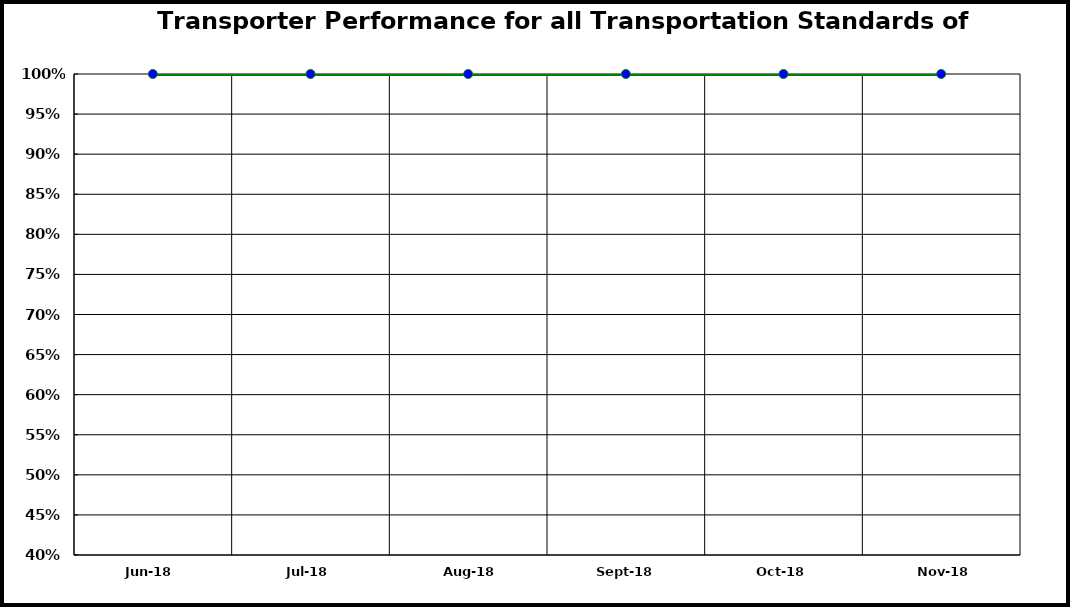
| Category | Performance |
|---|---|
| 2018-06-01 | 1 |
| 2018-07-01 | 1 |
| 2018-08-01 | 1 |
| 2018-09-01 | 1 |
| 2018-10-01 | 1 |
| 2018-11-01 | 1 |